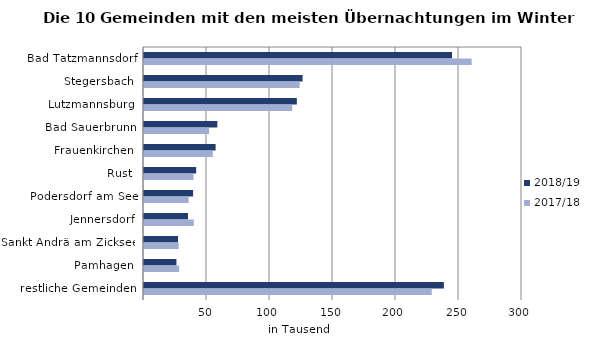
| Category | 2018/19 | 2017/18 |
|---|---|---|
| Bad Tatzmannsdorf | 244437 | 260060 |
| Stegersbach | 125870 | 123553 |
| Lutzmannsburg | 121298 | 117636 |
| Bad Sauerbrunn | 58200 | 51674 |
| Frauenkirchen | 56827 | 54647 |
| Rust | 41396 | 39347 |
| Podersdorf am See | 38954 | 35477 |
| Jennersdorf | 34912 | 39524 |
| Sankt Andrä am Zicksee | 26958 | 27512 |
| Pamhagen | 25733 | 27910 |
| restliche Gemeinden | 238011 | 228367 |